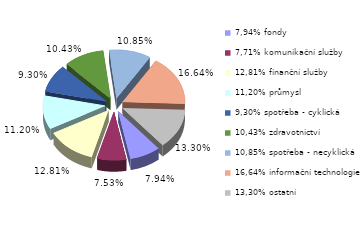
| Category | Series 0 |
|---|---|
| 7,94% fondy | 0.079 |
| 7,71% komunikační služby | 0.075 |
| 12,81% finanční služby | 0.128 |
| 11,20% průmysl | 0.112 |
| 9,30% spotřeba - cyklická | 0.093 |
| 10,43% zdravotnictví | 0.104 |
| 10,85% spotřeba - necyklická | 0.108 |
| 16,64% informační technologie | 0.166 |
| 13,30% ostatní | 0.133 |